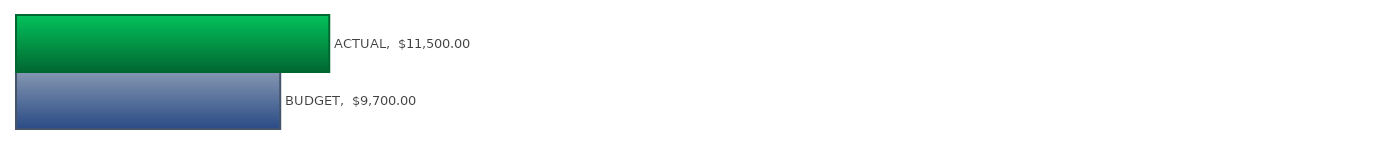
| Category | Series 0 |
|---|---|
| BUDGET | 9700 |
| ACTUAL | 11500 |